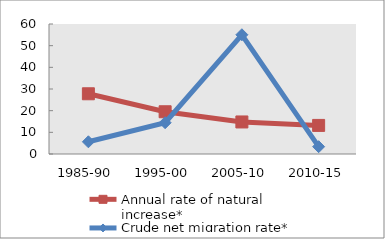
| Category | Annual rate of natural increase* | Crude net migration rate* |
|---|---|---|
| 1985-90 | 27.8 | 5.637 |
| 1995-00 | 19.493 | 14.439 |
| 2005-10 | 14.788 | 55.033 |
| 2010-15 | 13.194 | 3.382 |